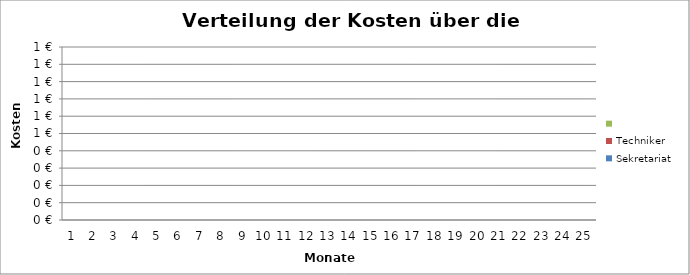
| Category | Sekretariat | Techniker | Series 1 |
|---|---|---|---|
| 1.0 | 0 | 0 | 0 |
| 2.0 | 0 | 0 | 0 |
| 3.0 | 0 | 0 | 0 |
| 4.0 | 0 | 0 | 0 |
| 5.0 | 0 | 0 | 0 |
| 6.0 | 0 | 0 | 0 |
| 7.0 | 0 | 0 | 0 |
| 8.0 | 0 | 0 | 0 |
| 9.0 | 0 | 0 | 0 |
| 10.0 | 0 | 0 | 0 |
| 11.0 | 0 | 0 | 0 |
| 12.0 | 0 | 0 | 0 |
| 13.0 | 0 | 0 | 0 |
| 14.0 | 0 | 0 | 0 |
| 15.0 | 0 | 0 | 0 |
| 16.0 | 0 | 0 | 0 |
| 17.0 | 0 | 0 | 0 |
| 18.0 | 0 | 0 | 0 |
| 19.0 | 0 | 0 | 0 |
| 20.0 | 0 | 0 | 0 |
| 21.0 | 0 | 0 | 0 |
| 22.0 | 0 | 0 | 0 |
| 23.0 | 0 | 0 | 0 |
| 24.0 | 0 | 0 | 0 |
| 25.0 | 0 | 0 | 0 |